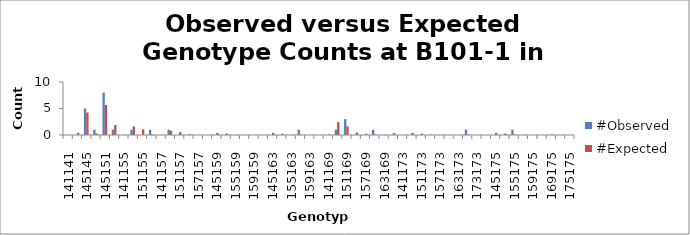
| Category | #Observed | #Expected |
|---|---|---|
| 141141.0 | 0 | 0.01 |
| 141145.0 | 0 | 0.404 |
| 145145.0 | 5 | 4.24 |
| 141151.0 | 1 | 0.269 |
| 145151.0 | 8 | 5.654 |
| 151151.0 | 1 | 1.885 |
| 141155.0 | 0 | 0.077 |
| 145155.0 | 1 | 1.615 |
| 151155.0 | 0 | 1.077 |
| 155155.0 | 1 | 0.154 |
| 141157.0 | 0 | 0.038 |
| 145157.0 | 1 | 0.808 |
| 151157.0 | 0 | 0.538 |
| 155157.0 | 0 | 0.154 |
| 157157.0 | 0 | 0.038 |
| 141159.0 | 0 | 0.019 |
| 145159.0 | 0 | 0.404 |
| 151159.0 | 0 | 0.269 |
| 155159.0 | 0 | 0.077 |
| 157159.0 | 0 | 0.038 |
| 159159.0 | 0 | 0.01 |
| 141163.0 | 0 | 0.019 |
| 145163.0 | 0 | 0.404 |
| 151163.0 | 0 | 0.269 |
| 155163.0 | 0 | 0.077 |
| 157163.0 | 1 | 0.038 |
| 159163.0 | 0 | 0.019 |
| 163163.0 | 0 | 0.01 |
| 141169.0 | 0 | 0.115 |
| 145169.0 | 1 | 2.423 |
| 151169.0 | 3 | 1.615 |
| 155169.0 | 0 | 0.462 |
| 157169.0 | 0 | 0.231 |
| 159169.0 | 1 | 0.115 |
| 163169.0 | 0 | 0.115 |
| 169169.0 | 0 | 0.346 |
| 141173.0 | 0 | 0.019 |
| 145173.0 | 0 | 0.404 |
| 151173.0 | 0 | 0.269 |
| 155173.0 | 0 | 0.077 |
| 157173.0 | 0 | 0.038 |
| 159173.0 | 0 | 0.019 |
| 163173.0 | 0 | 0.019 |
| 169173.0 | 1 | 0.115 |
| 173173.0 | 0 | 0.01 |
| 141175.0 | 0 | 0.019 |
| 145175.0 | 0 | 0.404 |
| 151175.0 | 0 | 0.269 |
| 155175.0 | 1 | 0.077 |
| 157175.0 | 0 | 0.038 |
| 159175.0 | 0 | 0.019 |
| 163175.0 | 0 | 0.019 |
| 169175.0 | 0 | 0.115 |
| 173175.0 | 0 | 0.019 |
| 175175.0 | 0 | 0.01 |